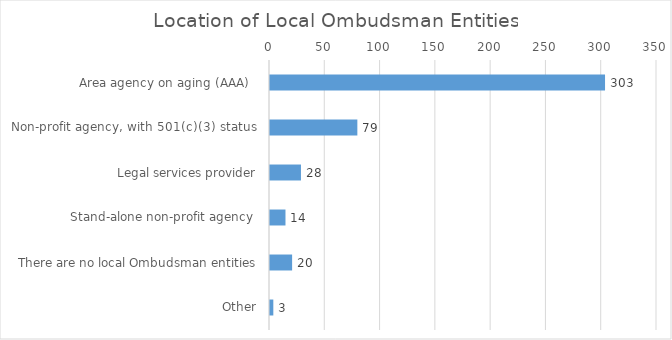
| Category | Location of Local Ombudsman Entities |
|---|---|
| Area agency on aging (AAA)   | 303 |
| Non-profit agency, with 501(c)(3) status  | 79 |
| Legal services provider | 28 |
| Stand-alone non-profit agency  | 14 |
| There are no local Ombudsman entities | 20 |
| Other | 3 |